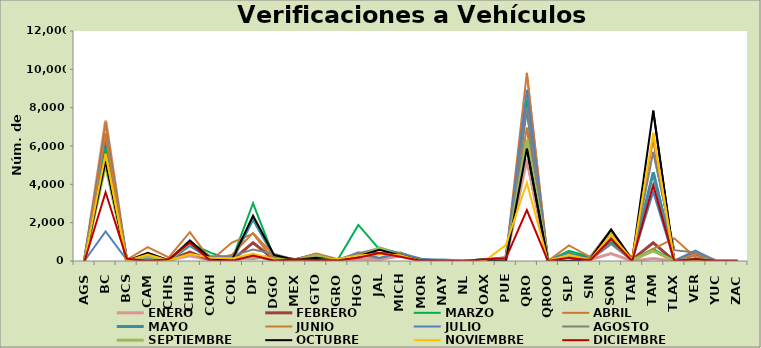
| Category | ENERO | FEBRERO | MARZO | ABRIL | MAYO | JUNIO | JULIO | AGOSTO | SEPTIEMBRE | OCTUBRE | NOVIEMBRE | DICIEMBRE |
|---|---|---|---|---|---|---|---|---|---|---|---|---|
| AGS | 0 | 17 | 0 | 25 | 67 | 64 | 14 | 0 | 15 | 0 | 0 | 0 |
| BC | 7321 | 6231 | 5883 | 7236 | 6641 | 6650 | 1539 | 5574 | 5020 | 5212 | 5589 | 3585 |
| BCS | 0 | 13 | 72 | 0 | 21 | 62 | 61 | 115 | 12 | 0 | 0 | 125 |
| CAM | 0 | 0 | 0 | 142 | 0 | 728 | 118 | 0 | 238 | 433 | 332 | 0 |
| CHIS | 50 | 30 | 55 | 63 | 0 | 184 | 43 | 54 | 38 | 37 | 26 | 97 |
| CHIH | 276 | 463 | 929 | 1093 | 820 | 1508 | 1075 | 885 | 955 | 1050 | 365 | 951 |
| COAH | 42 | 49 | 423 | 31 | 93 | 36 | 63 | 243 | 119 | 129 | 168 | 0 |
| COL | 162 | 31 | 59 | 960 | 32 | 326 | 51 | 261 | 29 | 58 | 130 | 0 |
| DF | 123 | 954 | 3012 | 1425 | 2189 | 1469 | 249 | 603 | 238 | 2362 | 392 | 282 |
| DGO | 281 | 88 | 191 | 17 | 244 | 274 | 7 | 365 | 105 | 311 | 76 | 22 |
| MEX | 36 | 61 | 100 | 81 | 72 | 56 | 72 | 73 | 42 | 60 | 59 | 72 |
| GTO | 300 | 339 | 220 | 387 | 333 | 382 | 148 | 55 | 288 | 169 | 57 | 54 |
| GRO | 9 | 12 | 30 | 107 | 28 | 43 | 19 | 63 | 29 | 27 | 98 | 33 |
| HGO | 99 | 344 | 1883 | 305 | 279 | 289 | 457 | 403 | 214 | 254 | 289 | 170 |
| JAL | 81 | 403 | 609 | 153 | 674 | 349 | 161 | 649 | 688 | 588 | 371 | 416 |
| MICH | 262 | 315 | 418 | 438 | 353 | 402 | 401 | 256 | 251 | 295 | 302 | 226 |
| MOR | 11 | 0 | 49 | 45 | 26 | 0 | 120 | 21 | 30 | 31 | 0 | 0 |
| NAY | 9 | 14 | 17 | 38 | 55 | 52 | 42 | 50 | 22 | 22 | 11 | 6 |
| NL | 0 | 0 | 0 | 0 | 0 | 0 | 0 | 0 | 0 | 0 | 0 | 0 |
| OAX | 0 | 53 | 99 | 0 | 53 | 60 | 0 | 25 | 0 | 0 | 0 | 93 |
| PUE | 38 | 171 | 171 | 157 | 113 | 129 | 128 | 120 | 95 | 0 | 830 | 128 |
| QRO | 5293 | 6208 | 8405 | 6952 | 8037 | 9814 | 8925 | 8025 | 6332 | 5854 | 4084 | 2653 |
| QROO | 0 | 0 | 8 | 0 | 0 | 0 | 0 | 0 | 0 | 0 | 0 | 0 |
| SLP | 175 | 361 | 529 | 0 | 417 | 815 | 0 | 187 | 190 | 0 | 324 | 165 |
| SIN | 69 | 164 | 219 | 186 | 62 | 221 | 92 | 57 | 82 | 87 | 57 | 35 |
| SON | 383 | 1589 | 985 | 1522 | 1238 | 1271 | 896 | 883 | 1439 | 1640 | 1371 | 1147 |
| TAB | 0 | 75 | 55 | 41 | 23 | 141 | 25 | 30 | 41 | 45 | 60 | 0 |
| TAM | 126 | 950 | 635 | 633 | 4628 | 6364 | 3602 | 5695 | 526 | 7840 | 6682 | 3962 |
| TLAX | 0 | 0 | 0 | 1183 | 0 | 0 | 18 | 565 | 0 | 0 | 0 | 0 |
| VER | 309 | 392 | 104 | 194 | 98 | 374 | 543 | 448 | 101 | 92 | 31 | 92 |
| YUC | 0 | 0 | 0 | 0 | 0 | 0 | 0 | 0 | 0 | 0 | 0 | 0 |
| ZAC | 0 | 0 | 0 | 0 | 0 | 0 | 0 | 0 | 0 | 0 | 0 | 0 |